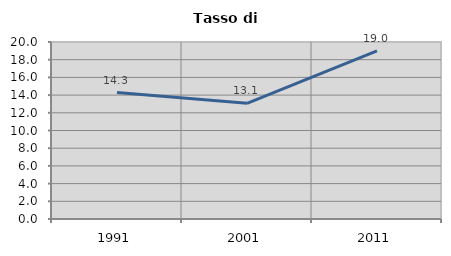
| Category | Tasso di disoccupazione   |
|---|---|
| 1991.0 | 14.286 |
| 2001.0 | 13.072 |
| 2011.0 | 19.008 |